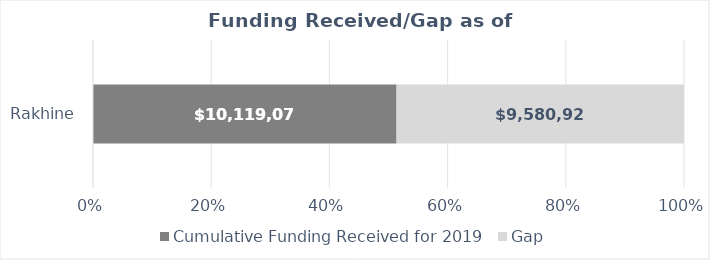
| Category | Cumulative Funding Received for 2019 | Gap |
|---|---|---|
| Rakhine | 10119072.808 | 9580927.192 |